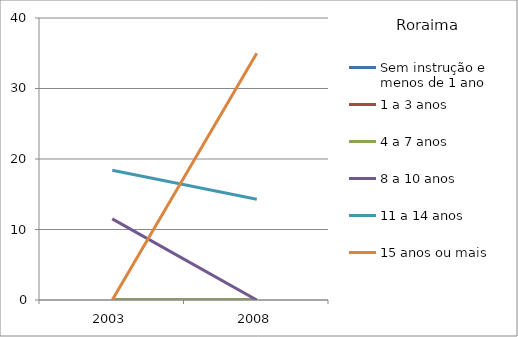
| Category | Sem instrução e menos de 1 ano | 1 a 3 anos | 4 a 7 anos | 8 a 10 anos | 11 a 14 anos | 15 anos ou mais |
|---|---|---|---|---|---|---|
| 2003.0 | 0 | 0 | 0 | 11.5 | 18.4 | 0 |
| 2008.0 | 0 | 0 | 0 | 0 | 14.3 | 35 |